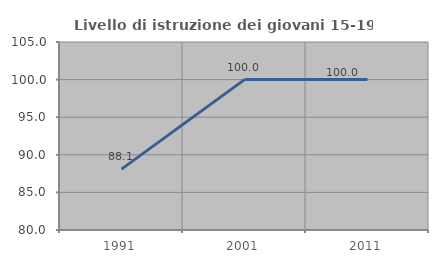
| Category | Livello di istruzione dei giovani 15-19 anni |
|---|---|
| 1991.0 | 88.095 |
| 2001.0 | 100 |
| 2011.0 | 100 |